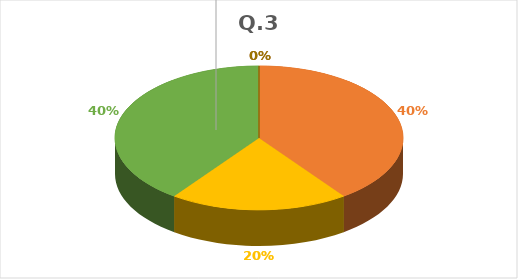
| Category | Series 0 |
|---|---|
| Excellent  | 6 |
| Very Good | 3 |
| Good | 6 |
| Average | 0 |
| Below Average | 0 |